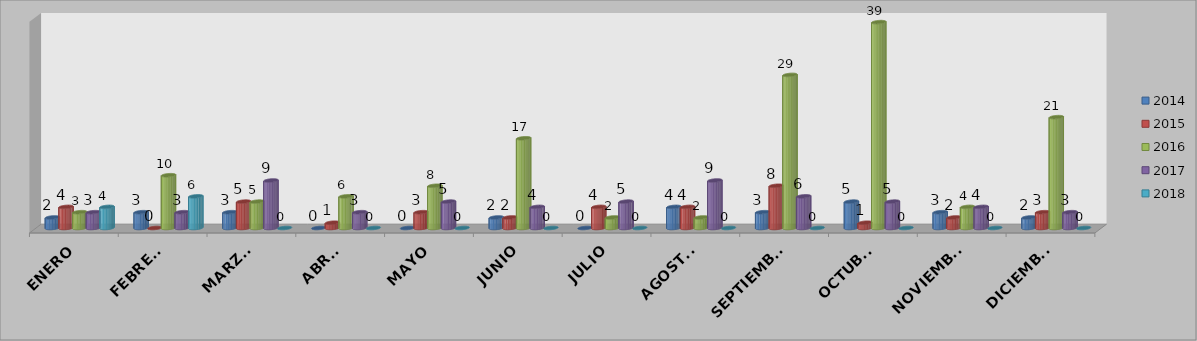
| Category | 2014 | 2015 | 2016 | 2017 | 2018 |
|---|---|---|---|---|---|
| ENERO | 2 | 4 | 3 | 3 | 4 |
| FEBRERO | 3 | 0 | 10 | 3 | 6 |
| MARZO  | 3 | 5 | 5 | 9 | 0 |
| ABRIL | 0 | 1 | 6 | 3 | 0 |
| MAYO | 0 | 3 | 8 | 5 | 0 |
| JUNIO | 2 | 2 | 17 | 4 | 0 |
| JULIO | 0 | 4 | 2 | 5 | 0 |
| AGOSTO | 4 | 4 | 2 | 9 | 0 |
| SEPTIEMBRE | 3 | 8 | 29 | 6 | 0 |
| OCTUBRE | 5 | 1 | 39 | 5 | 0 |
| NOVIEMBRE | 3 | 2 | 4 | 4 | 0 |
| DICIEMBRE | 2 | 3 | 21 | 3 | 0 |